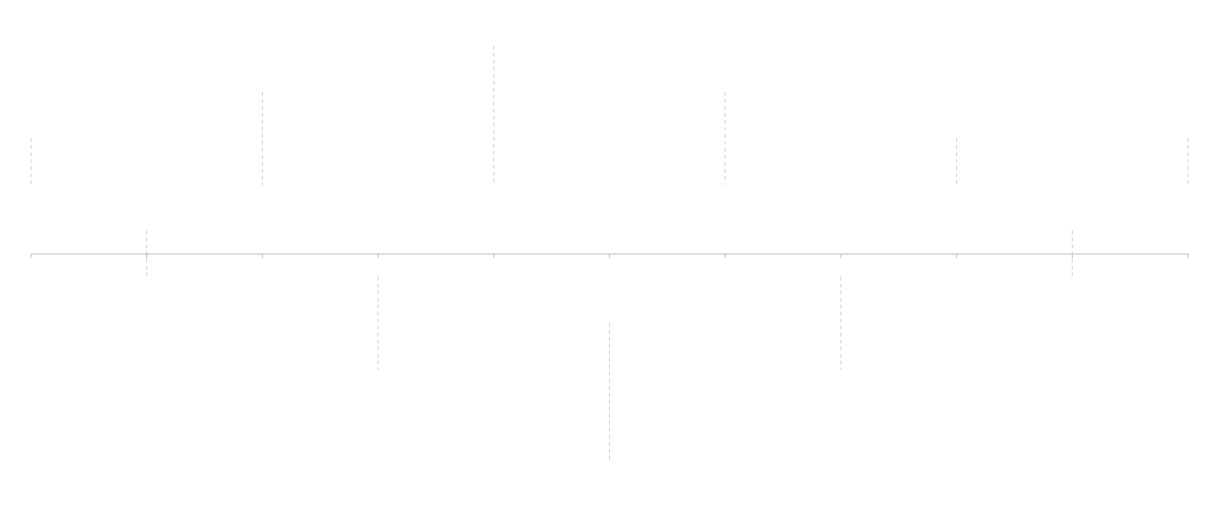
| Category | Series 1 |
|---|---|
|  | 5 |
|  | -5 |
|  | 10 |
|  | -10 |
|  | 15 |
|  | -15 |
|  | 10 |
|  | -10 |
|  | 5 |
|  | -5 |
|  | 5 |